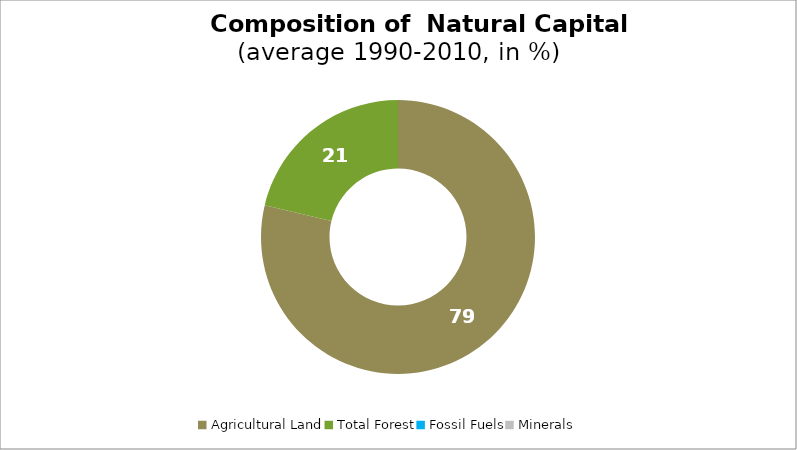
| Category | Series 0 |
|---|---|
| Agricultural Land | 78.728 |
| Total Forest | 21.272 |
| Fossil Fuels | 0 |
| Minerals | 0 |